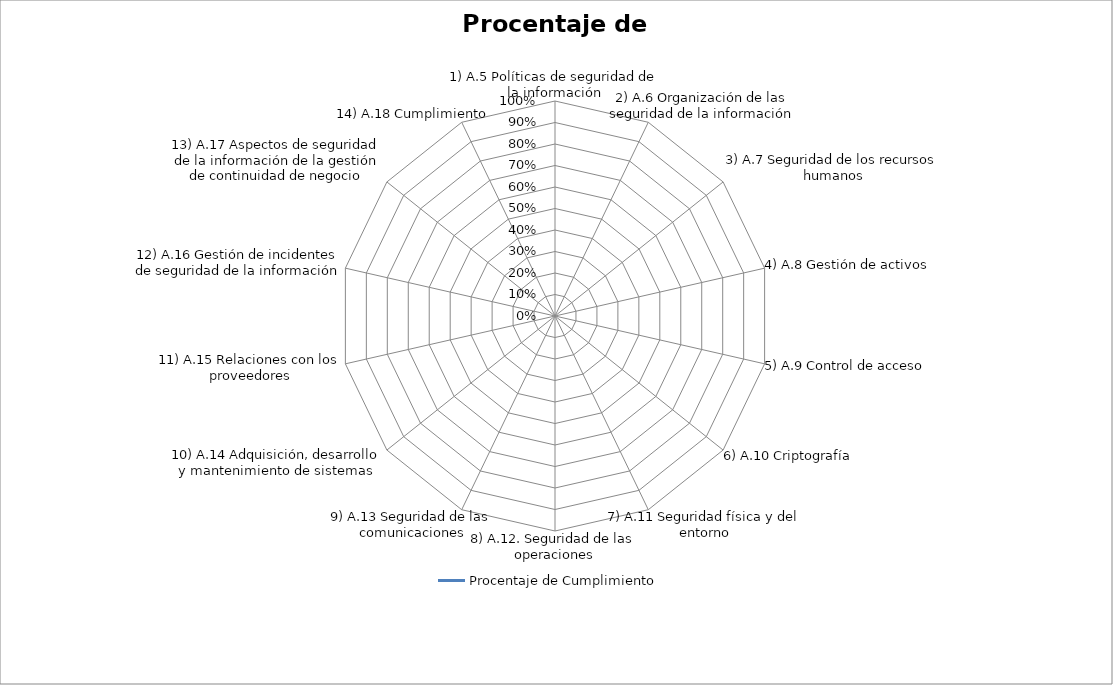
| Category | Procentaje de Cumplimiento |
|---|---|
| 1) A.5 Políticas de seguridad de la información | 0 |
| 2) A.6 Organización de las seguridad de la información | 0 |
| 3) A.7 Seguridad de los recursos humanos | 0 |
| 4) A.8 Gestión de activos | 0 |
| 5) A.9 Control de acceso | 0 |
| 6) A.10 Criptografía | 0 |
| 7) A.11 Seguridad física y del entorno | 0 |
| 8) A.12. Seguridad de las operaciones | 0 |
| 9) A.13 Seguridad de las comunicaciones | 0 |
| 10) A.14 Adquisición, desarrollo y mantenimiento de sistemas | 0 |
| 11) A.15 Relaciones con los proveedores | 0 |
| 12) A.16 Gestión de incidentes de seguridad de la información | 0 |
| 13) A.17 Aspectos de seguridad de la información de la gestión de continuidad de negocio | 0 |
| 14) A.18 Cumplimiento | 0 |